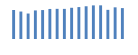
| Category | Exportações (1) |
|---|---|
| 0 | 392293.987 |
| 1 | 370979.678 |
| 2 | 344221.998 |
| 3 | 386156.652 |
| 4 | 390987.572 |
| 5 | 406063.094 |
| 6 | 407598.054 |
| 7 | 406953.169 |
| 8 | 421887.391 |
| 9 | 431264.801 |
| 10 | 442364.452 |
| 11 | 454202.095 |
| 12 | 454929.952 |
| 13 | 393954.142 |
| 14 | 427968.658 |
| 15 | 417555.742 |